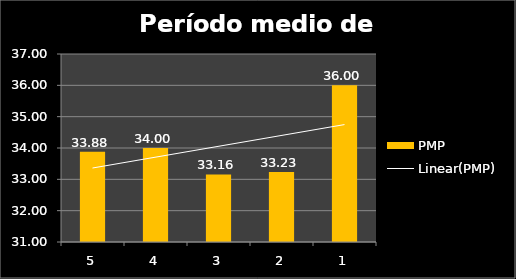
| Category | PMP |
|---|---|
| 5.0 | 33.882 |
| 4.0 | 34 |
| 3.0 | 33.158 |
| 2.0 | 33.231 |
| 1.0 | 36 |